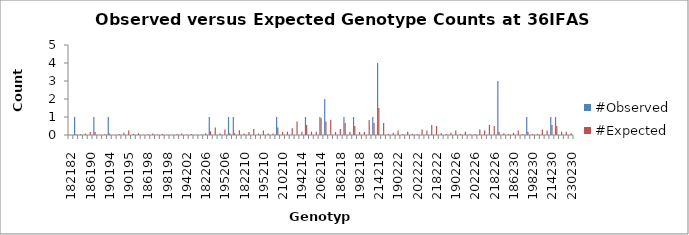
| Category | #Observed | #Expected |
|---|---|---|
| 182182.0 | 0 | 0.01 |
| 182186.0 | 1 | 0.042 |
| 186186.0 | 0 | 0.042 |
| 182190.0 | 0 | 0.083 |
| 186190.0 | 0 | 0.167 |
| 190190.0 | 1 | 0.167 |
| 182194.0 | 0 | 0.021 |
| 186194.0 | 0 | 0.042 |
| 190194.0 | 1 | 0.083 |
| 194194.0 | 0 | 0.01 |
| 182195.0 | 0 | 0.062 |
| 186195.0 | 0 | 0.125 |
| 190195.0 | 0 | 0.25 |
| 194195.0 | 0 | 0.062 |
| 195195.0 | 0 | 0.094 |
| 182198.0 | 0 | 0.021 |
| 186198.0 | 0 | 0.042 |
| 190198.0 | 0 | 0.083 |
| 194198.0 | 0 | 0.021 |
| 195198.0 | 0 | 0.062 |
| 198198.0 | 0 | 0.01 |
| 182202.0 | 0 | 0.021 |
| 186202.0 | 0 | 0.042 |
| 190202.0 | 0 | 0.083 |
| 194202.0 | 0 | 0.021 |
| 195202.0 | 0 | 0.062 |
| 198202.0 | 0 | 0.021 |
| 202202.0 | 0 | 0.01 |
| 182206.0 | 0 | 0.104 |
| 186206.0 | 1 | 0.208 |
| 190206.0 | 0 | 0.417 |
| 194206.0 | 0 | 0.104 |
| 195206.0 | 0 | 0.312 |
| 198206.0 | 1 | 0.104 |
| 202206.0 | 1 | 0.104 |
| 206206.0 | 0 | 0.26 |
| 182210.0 | 0 | 0.083 |
| 186210.0 | 0 | 0.167 |
| 190210.0 | 0 | 0.333 |
| 194210.0 | 0 | 0.083 |
| 195210.0 | 0 | 0.25 |
| 198210.0 | 0 | 0.083 |
| 202210.0 | 0 | 0.083 |
| 206210.0 | 1 | 0.417 |
| 210210.0 | 0 | 0.167 |
| 182214.0 | 0 | 0.188 |
| 186214.0 | 0 | 0.375 |
| 190214.0 | 0 | 0.75 |
| 194214.0 | 0 | 0.188 |
| 195214.0 | 1 | 0.562 |
| 198214.0 | 0 | 0.188 |
| 202214.0 | 0 | 0.188 |
| 206214.0 | 1 | 0.938 |
| 210214.0 | 2 | 0.75 |
| 214214.0 | 0 | 0.844 |
| 182218.0 | 0 | 0.167 |
| 186218.0 | 0 | 0.333 |
| 190218.0 | 1 | 0.667 |
| 194218.0 | 0 | 0.167 |
| 195218.0 | 1 | 0.5 |
| 198218.0 | 0 | 0.167 |
| 202218.0 | 0 | 0.167 |
| 206218.0 | 0 | 0.833 |
| 210218.0 | 1 | 0.667 |
| 214218.0 | 4 | 1.5 |
| 218218.0 | 0 | 0.667 |
| 182222.0 | 0 | 0.062 |
| 186222.0 | 0 | 0.125 |
| 190222.0 | 0 | 0.25 |
| 194222.0 | 0 | 0.062 |
| 195222.0 | 0 | 0.188 |
| 198222.0 | 0 | 0.062 |
| 202222.0 | 0 | 0.062 |
| 206222.0 | 0 | 0.312 |
| 210222.0 | 0 | 0.25 |
| 214222.0 | 0 | 0.562 |
| 218222.0 | 0 | 0.5 |
| 222222.0 | 0 | 0.094 |
| 182226.0 | 0 | 0.062 |
| 186226.0 | 0 | 0.125 |
| 190226.0 | 0 | 0.25 |
| 194226.0 | 0 | 0.062 |
| 195226.0 | 0 | 0.188 |
| 198226.0 | 0 | 0.062 |
| 202226.0 | 0 | 0.062 |
| 206226.0 | 0 | 0.312 |
| 210226.0 | 0 | 0.25 |
| 214226.0 | 0 | 0.562 |
| 218226.0 | 0 | 0.5 |
| 222226.0 | 3 | 0.188 |
| 226226.0 | 0 | 0.094 |
| 182230.0 | 0 | 0.062 |
| 186230.0 | 0 | 0.125 |
| 190230.0 | 0 | 0.25 |
| 194230.0 | 0 | 0.062 |
| 195230.0 | 1 | 0.188 |
| 198230.0 | 0 | 0.062 |
| 202230.0 | 0 | 0.062 |
| 206230.0 | 0 | 0.312 |
| 210230.0 | 0 | 0.25 |
| 214230.0 | 1 | 0.562 |
| 218230.0 | 1 | 0.5 |
| 222230.0 | 0 | 0.188 |
| 226230.0 | 0 | 0.188 |
| 230230.0 | 0 | 0.094 |